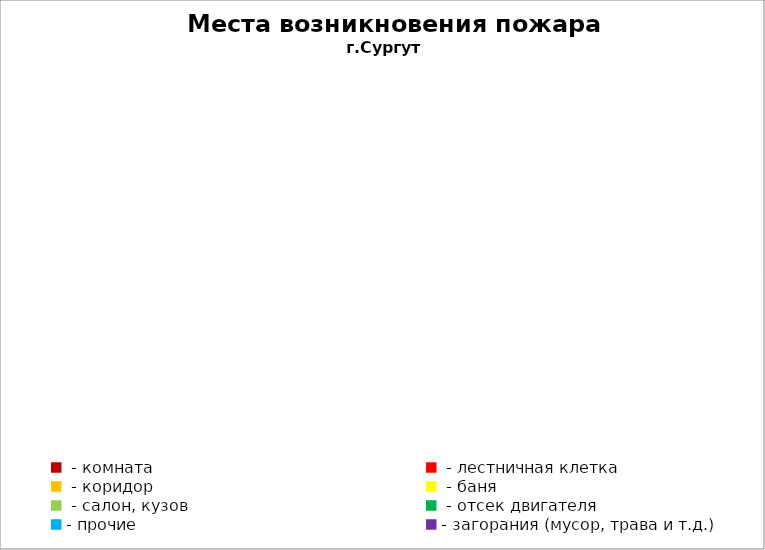
| Category | Места возникновения пожара |
|---|---|
|  - комната | 55 |
|  - лестничная клетка | 14 |
|  - коридор | 11 |
|  - баня | 32 |
|  - салон, кузов | 19 |
|  - отсек двигателя | 41 |
| - прочие | 85 |
| - загорания (мусор, трава и т.д.)  | 146 |